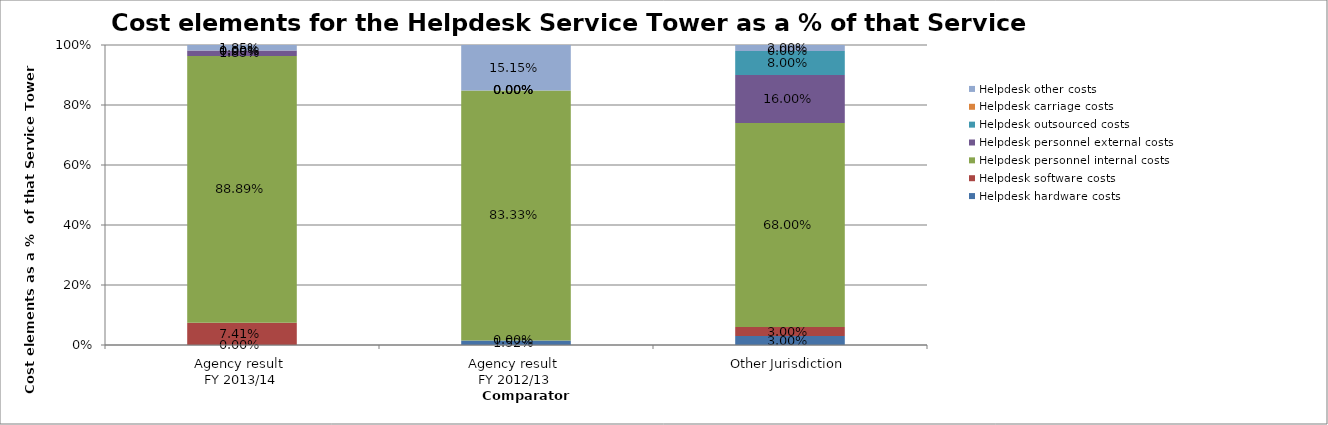
| Category | Helpdesk hardware costs | Helpdesk software costs | Helpdesk personnel internal costs | Helpdesk personnel external costs | Helpdesk outsourced costs | Helpdesk carriage costs | Helpdesk other costs |
|---|---|---|---|---|---|---|---|
| Agency result 
FY 2013/14 | 0 | 0.074 | 0.889 | 0.018 | 0 | 0 | 0.018 |
| Agency result 
FY 2012/13 | 0.015 | 0 | 0.833 | 0 | 0 | 0 | 0.152 |
| Other Jurisdiction | 0.03 | 0.03 | 0.68 | 0.16 | 0.08 | 0 | 0.02 |